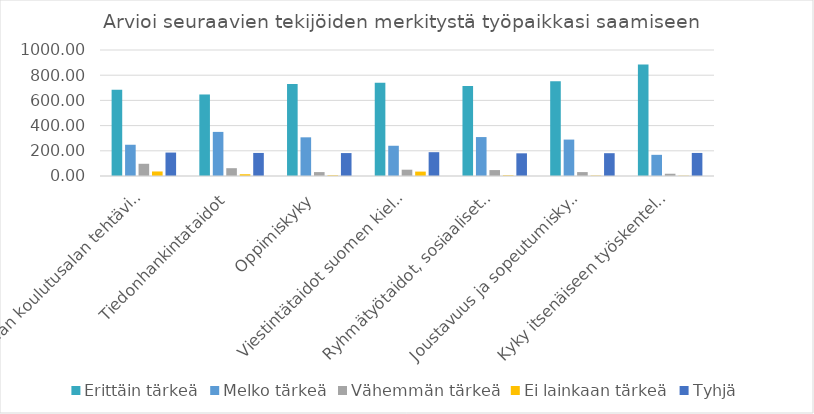
| Category | Erittäin tärkeä | Melko tärkeä | Vähemmän tärkeä | Ei lainkaan tärkeä | Tyhjä |
|---|---|---|---|---|---|
| Oman koulutusalan tehtävien käytännön taidot | 684 | 248 | 97 | 36 | 186 |
| Tiedonhankintataidot | 647 | 350 | 62 | 14 | 183 |
| Oppimiskyky | 731 | 307 | 31 | 5 | 182 |
| Viestintätaidot suomen kielellä | 741 | 240 | 50 | 35 | 189 |
| Ryhmätyötaidot, sosiaaliset taidot | 715 | 309 | 47 | 5 | 180 |
| Joustavuus ja sopeutumiskyky | 752 | 289 | 31 | 3 | 181 |
| Kyky itsenäiseen työskentelyyn | 885 | 168 | 18 | 2 | 183 |